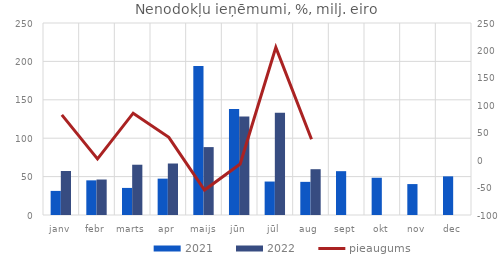
| Category | 2021 | 2022 |
|---|---|---|
| janv | 31.371 | 57.283 |
| febr | 45.121 | 46.205 |
| marts | 35.265 | 65.464 |
| apr | 47.331 | 67.049 |
| maijs | 194.131 | 88.415 |
| jūn | 137.903 | 128.25 |
| jūl | 43.57 | 133.112 |
| aug | 43.157 | 59.639 |
| sept | 57.071 | 0 |
| okt | 48.487 | 0 |
| nov | 40.268 | 0 |
| dec | 50.336 | 0 |